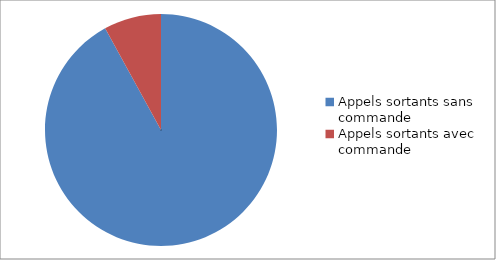
| Category | Series 0 |
|---|---|
| Appels sortants sans commande | 0.92 |
| Appels sortants avec commande | 0.08 |